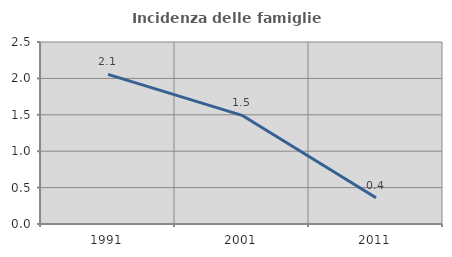
| Category | Incidenza delle famiglie numerose |
|---|---|
| 1991.0 | 2.055 |
| 2001.0 | 1.493 |
| 2011.0 | 0.361 |